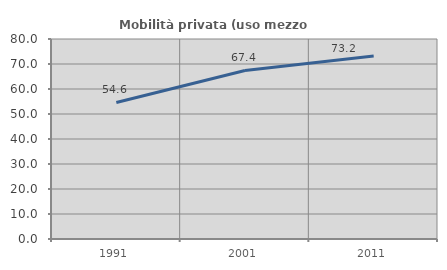
| Category | Mobilità privata (uso mezzo privato) |
|---|---|
| 1991.0 | 54.622 |
| 2001.0 | 67.413 |
| 2011.0 | 73.233 |